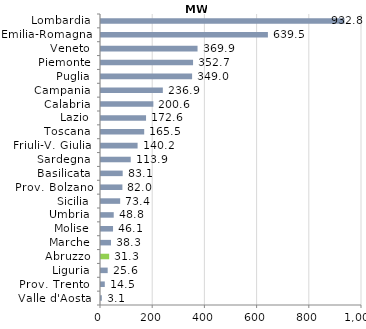
| Category | Series 0 |
|---|---|
| Valle d'Aosta | 3.1 |
| Prov. Trento  | 14.5 |
| Liguria | 25.6 |
| Abruzzo | 31.3 |
| Marche | 38.3 |
| Molise | 46.1 |
| Umbria | 48.8 |
| Sicilia | 73.4 |
| Prov. Bolzano | 82 |
| Basilicata | 83.1 |
| Sardegna | 113.9 |
| Friuli-V. Giulia | 140.2 |
| Toscana | 165.5 |
| Lazio | 172.6 |
| Calabria | 200.6 |
| Campania | 236.9 |
| Puglia | 349 |
| Piemonte | 352.7 |
| Veneto | 369.9 |
| Emilia-Romagna | 639.5 |
| Lombardia | 932.8 |